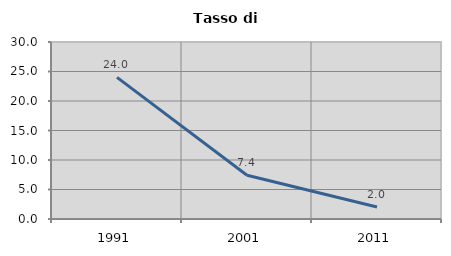
| Category | Tasso di disoccupazione   |
|---|---|
| 1991.0 | 24 |
| 2001.0 | 7.407 |
| 2011.0 | 2.041 |